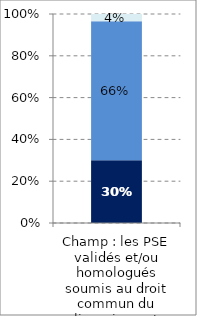
| Category | Homologation | Validation | Accord mixte (validation-homologation) |
|---|---|---|---|
| Champ : les PSE validés et/ou homologués soumis au droit commun du licenciement | 0.3 | 0.665 | 0.035 |